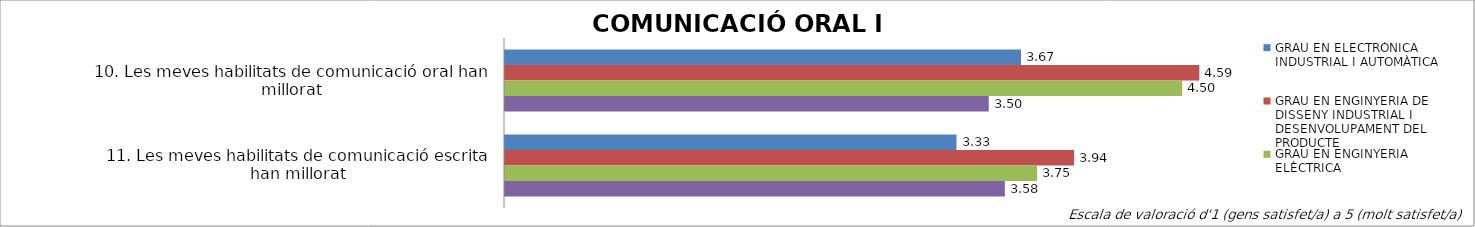
| Category | GRAU EN ELECTRÒNICA INDUSTRIAL I AUTOMÀTICA | GRAU EN ENGINYERIA DE DISSENY INDUSTRIAL I DESENVOLUPAMENT DEL PRODUCTE | GRAU EN ENGINYERIA ELÈCTRICA | GRAU EN ENGINYERIA MECÀNICA |
|---|---|---|---|---|
| 10. Les meves habilitats de comunicació oral han millorat | 3.667 | 4.588 | 4.5 | 3.5 |
| 11. Les meves habilitats de comunicació escrita han millorat | 3.333 | 3.941 | 3.75 | 3.583 |